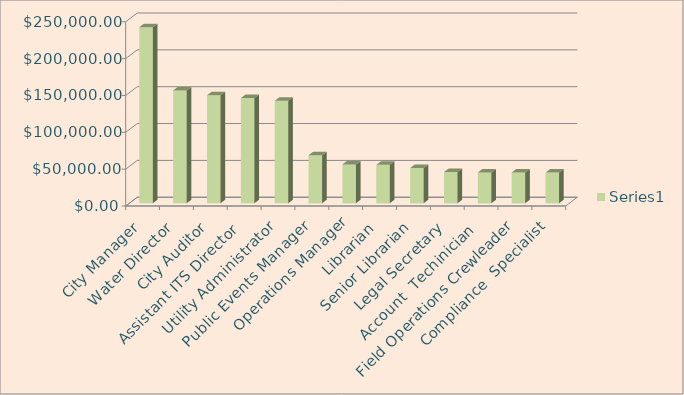
| Category | Series 0 |
|---|---|
| City Manager | 239057.725 |
| Water Director | 153240.88 |
| City Auditor | 146695.64 |
| Assistant ITS Director  | 142877.595 |
| Utility Administrator | 139190.37 |
| Public Events Manager | 65418.44 |
| Operations Manager | 52862.885 |
| Librarian | 52241.28 |
| Senior Librarian | 47947.64 |
| Legal Secretary | 42505.95 |
| Account  Techinician  | 41901.6 |
| Field Operations Crewleader | 41879.76 |
| Compliance  Specialist  | 41771.6 |